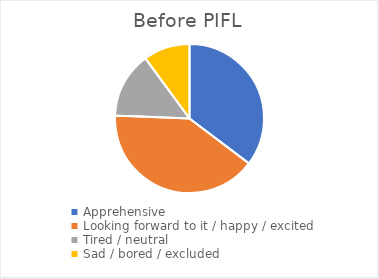
| Category | Before PIFL |
|---|---|
| Apprehensive | 0.42 |
| Looking forward to it / happy / excited | 0.48 |
| Tired / neutral | 0.17 |
| Sad / bored / excluded | 0.12 |